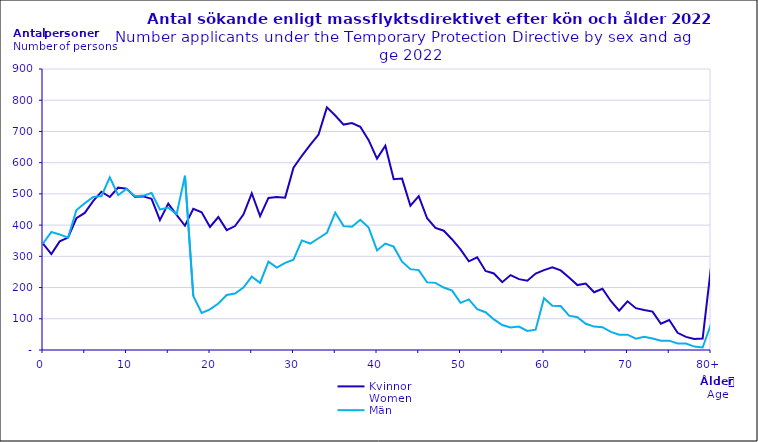
| Category | Kvinnor
Women | Män
Men |
|---|---|---|
| 0 | 341 | 341 |
| 1 | 307 | 378 |
| 2 | 348 | 370 |
| 3 | 360 | 360 |
| 4 | 422 | 448 |
| 5 | 439 | 470 |
| 6 | 477 | 490 |
| 7 | 507 | 493 |
| 8 | 490 | 553 |
| 9 | 520 | 496 |
| 10 | 517 | 516 |
| 11 | 491 | 493 |
| 12 | 492 | 494 |
| 13 | 484 | 503 |
| 14 | 416 | 450 |
| 15 | 469 | 456 |
| 16 | 433 | 435 |
| 17 | 398 | 558 |
| 18 | 452 | 173 |
| 19 | 441 | 119 |
| 20 | 394 | 130 |
| 21 | 426 | 149 |
| 22 | 384 | 176 |
| 23 | 397 | 181 |
| 24 | 434 | 200 |
| 25 | 502 | 235 |
| 26 | 429 | 215 |
| 27 | 487 | 283 |
| 28 | 490 | 264 |
| 29 | 488 | 279 |
| 30 | 584 | 289 |
| 31 | 622 | 351 |
| 32 | 657 | 341 |
| 33 | 690 | 358 |
| 34 | 777 | 375 |
| 35 | 751 | 440 |
| 36 | 722 | 397 |
| 37 | 727 | 395 |
| 38 | 715 | 417 |
| 39 | 672 | 392 |
| 40 | 613 | 319 |
| 41 | 654 | 341 |
| 42 | 547 | 331 |
| 43 | 549 | 283 |
| 44 | 462 | 259 |
| 45 | 493 | 256 |
| 46 | 422 | 217 |
| 47 | 391 | 215 |
| 48 | 382 | 200 |
| 49 | 354 | 190 |
| 50 | 322 | 151 |
| 51 | 284 | 162 |
| 52 | 297 | 131 |
| 53 | 253 | 121 |
| 54 | 245 | 98 |
| 55 | 217 | 80 |
| 56 | 240 | 72 |
| 57 | 227 | 75 |
| 58 | 222 | 61 |
| 59 | 245 | 65 |
| 60 | 256 | 166 |
| 61 | 265 | 142 |
| 62 | 255 | 141 |
| 63 | 232 | 110 |
| 64 | 208 | 105 |
| 65 | 213 | 84 |
| 66 | 185 | 75 |
| 67 | 196 | 73 |
| 68 | 157 | 58 |
| 69 | 126 | 49 |
| 70 | 156 | 49 |
| 71 | 134 | 36 |
| 72 | 128 | 42 |
| 73 | 123 | 37 |
| 74 | 84 | 30 |
| 75 | 96 | 30 |
| 76 | 55 | 21 |
| 77 | 42 | 21 |
| 78 | 35 | 11 |
| 79 | 37 | 8 |
| 80+ | 265 | 83 |